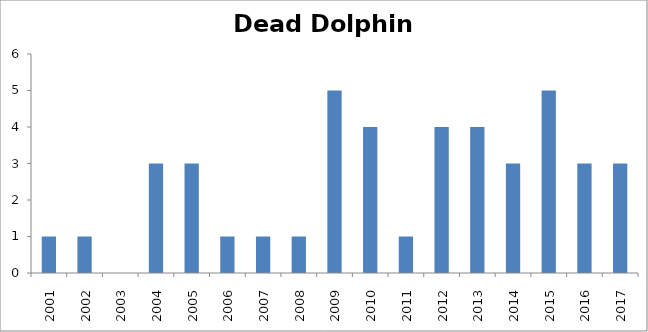
| Category | Number of animals |
|---|---|
| 2001 | 1 |
| 2002 | 1 |
| 2003 | 0 |
| 2004 | 3 |
| 2005 | 3 |
| 2006 | 1 |
| 2007 | 1 |
| 2008 | 1 |
| 2009 | 5 |
| 2010 | 4 |
| 2011 | 1 |
| 2012 | 4 |
| 2013 | 4 |
| 2014 | 3 |
| 2015 | 5 |
| 2016 | 3 |
| 2017 | 3 |